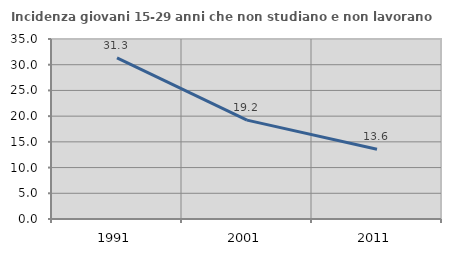
| Category | Incidenza giovani 15-29 anni che non studiano e non lavorano  |
|---|---|
| 1991.0 | 31.343 |
| 2001.0 | 19.231 |
| 2011.0 | 13.559 |